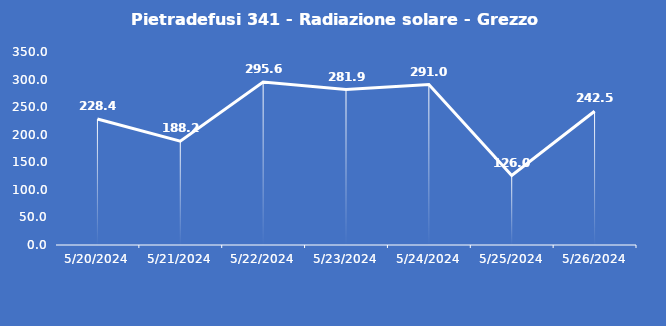
| Category | Pietradefusi 341 - Radiazione solare - Grezzo (W/m2) |
|---|---|
| 5/20/24 | 228.4 |
| 5/21/24 | 188.2 |
| 5/22/24 | 295.6 |
| 5/23/24 | 281.9 |
| 5/24/24 | 291 |
| 5/25/24 | 126 |
| 5/26/24 | 242.5 |